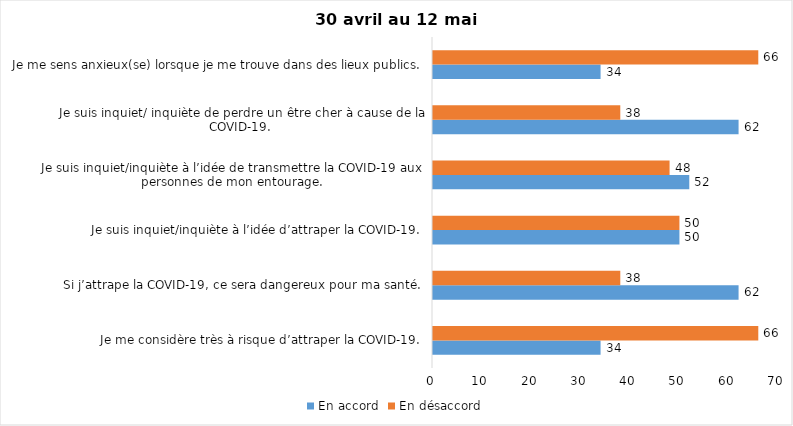
| Category | En accord | En désaccord |
|---|---|---|
| Je me considère très à risque d’attraper la COVID-19. | 34 | 66 |
| Si j’attrape la COVID-19, ce sera dangereux pour ma santé. | 62 | 38 |
| Je suis inquiet/inquiète à l’idée d’attraper la COVID-19. | 50 | 50 |
| Je suis inquiet/inquiète à l’idée de transmettre la COVID-19 aux personnes de mon entourage. | 52 | 48 |
| Je suis inquiet/ inquiète de perdre un être cher à cause de la COVID-19. | 62 | 38 |
| Je me sens anxieux(se) lorsque je me trouve dans des lieux publics. | 34 | 66 |